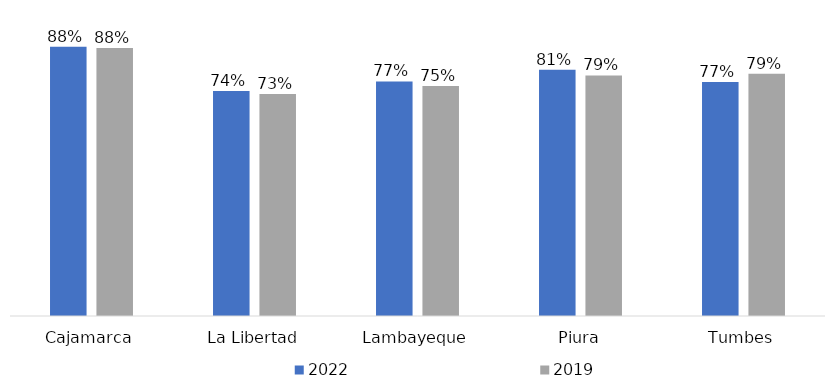
| Category | 2022 | 2019 |
|---|---|---|
| Cajamarca | 0.883 | 0.879 |
| La Libertad | 0.737 | 0.728 |
| Lambayeque | 0.769 | 0.754 |
| Piura | 0.807 | 0.789 |
| Tumbes | 0.767 | 0.794 |